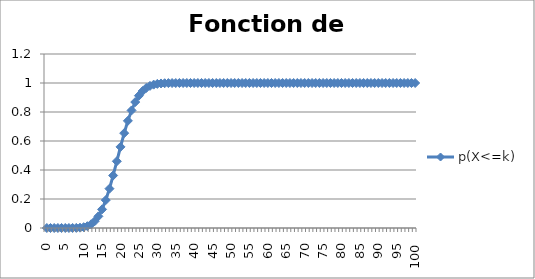
| Category | p(X<=k) |
|---|---|
| 0.0 | 0 |
| 1.0 | 0 |
| 2.0 | 0 |
| 3.0 | 0 |
| 4.0 | 0 |
| 5.0 | 0 |
| 6.0 | 0 |
| 7.0 | 0 |
| 8.0 | 0.001 |
| 9.0 | 0.002 |
| 10.0 | 0.006 |
| 11.0 | 0.013 |
| 12.0 | 0.025 |
| 13.0 | 0.047 |
| 14.0 | 0.08 |
| 15.0 | 0.129 |
| 16.0 | 0.192 |
| 17.0 | 0.271 |
| 18.0 | 0.362 |
| 19.0 | 0.46 |
| 20.0 | 0.559 |
| 21.0 | 0.654 |
| 22.0 | 0.739 |
| 23.0 | 0.811 |
| 24.0 | 0.869 |
| 25.0 | 0.913 |
| 26.0 | 0.944 |
| 27.0 | 0.966 |
| 28.0 | 0.98 |
| 29.0 | 0.989 |
| 30.0 | 0.994 |
| 31.0 | 0.997 |
| 32.0 | 0.998 |
| 33.0 | 0.999 |
| 34.0 | 1 |
| 35.0 | 1 |
| 36.0 | 1 |
| 37.0 | 1 |
| 38.0 | 1 |
| 39.0 | 1 |
| 40.0 | 1 |
| 41.0 | 1 |
| 42.0 | 1 |
| 43.0 | 1 |
| 44.0 | 1 |
| 45.0 | 1 |
| 46.0 | 1 |
| 47.0 | 1 |
| 48.0 | 1 |
| 49.0 | 1 |
| 50.0 | 1 |
| 51.0 | 1 |
| 52.0 | 1 |
| 53.0 | 1 |
| 54.0 | 1 |
| 55.0 | 1 |
| 56.0 | 1 |
| 57.0 | 1 |
| 58.0 | 1 |
| 59.0 | 1 |
| 60.0 | 1 |
| 61.0 | 1 |
| 62.0 | 1 |
| 63.0 | 1 |
| 64.0 | 1 |
| 65.0 | 1 |
| 66.0 | 1 |
| 67.0 | 1 |
| 68.0 | 1 |
| 69.0 | 1 |
| 70.0 | 1 |
| 71.0 | 1 |
| 72.0 | 1 |
| 73.0 | 1 |
| 74.0 | 1 |
| 75.0 | 1 |
| 76.0 | 1 |
| 77.0 | 1 |
| 78.0 | 1 |
| 79.0 | 1 |
| 80.0 | 1 |
| 81.0 | 1 |
| 82.0 | 1 |
| 83.0 | 1 |
| 84.0 | 1 |
| 85.0 | 1 |
| 86.0 | 1 |
| 87.0 | 1 |
| 88.0 | 1 |
| 89.0 | 1 |
| 90.0 | 1 |
| 91.0 | 1 |
| 92.0 | 1 |
| 93.0 | 1 |
| 94.0 | 1 |
| 95.0 | 1 |
| 96.0 | 1 |
| 97.0 | 1 |
| 98.0 | 1 |
| 99.0 | 1 |
| 100.0 | 1 |